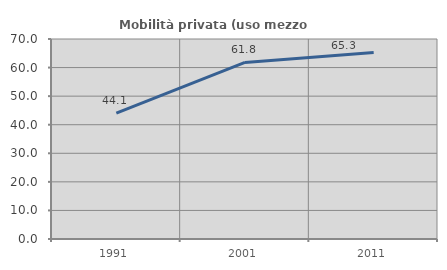
| Category | Mobilità privata (uso mezzo privato) |
|---|---|
| 1991.0 | 44.063 |
| 2001.0 | 61.793 |
| 2011.0 | 65.267 |